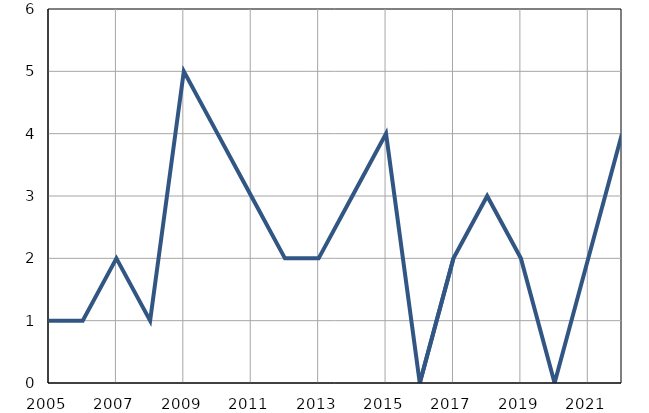
| Category | Умрла 
одојчад |
|---|---|
| 2005.0 | 1 |
| 2006.0 | 1 |
| 2007.0 | 2 |
| 2008.0 | 1 |
| 2009.0 | 5 |
| 2010.0 | 4 |
| 2011.0 | 3 |
| 2012.0 | 2 |
| 2013.0 | 2 |
| 2014.0 | 3 |
| 2015.0 | 4 |
| 2016.0 | 0 |
| 2017.0 | 2 |
| 2018.0 | 3 |
| 2019.0 | 2 |
| 2020.0 | 0 |
| 2021.0 | 2 |
| 2022.0 | 4 |